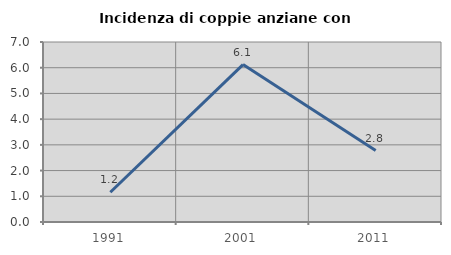
| Category | Incidenza di coppie anziane con figli |
|---|---|
| 1991.0 | 1.158 |
| 2001.0 | 6.122 |
| 2011.0 | 2.778 |